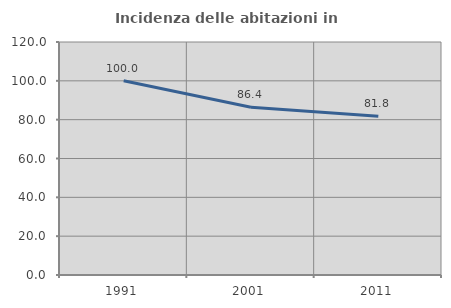
| Category | Incidenza delle abitazioni in proprietà  |
|---|---|
| 1991.0 | 100 |
| 2001.0 | 86.364 |
| 2011.0 | 81.818 |